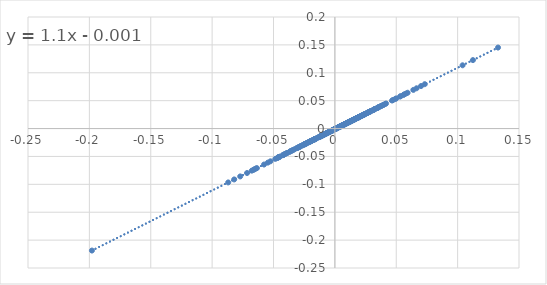
| Category | SPY |
|---|---|
| -0.007057278844575738 | -0.009 |
| 0.03949500980977561 | 0.042 |
| -0.029311915210731076 | -0.033 |
| 0.009613776960374448 | 0.01 |
| 0.07321012022250145 | 0.08 |
| -0.04629075040643459 | -0.052 |
| -0.03691800576843832 | -0.042 |
| 0.009399434370321041 | 0.009 |
| -0.0242675107539972 | -0.028 |
| 0.03738317757009344 | 0.04 |
| 0.011411053393510935 | 0.012 |
| 0.059263936496482116 | 0.064 |
| 0.022599391200073822 | 0.024 |
| -0.003401360544217729 | -0.005 |
| -0.06562446315066141 | -0.073 |
| 0.053670015386007845 | 0.058 |
| -0.016380308021009555 | -0.019 |
| -0.0009782995375311227 | -0.002 |
| 0.04731743666169894 | 0.051 |
| -0.046451727506883415 | -0.052 |
| -0.01625163826998689 | -0.019 |
| -0.07155025553662686 | -0.08 |
| -0.03898027598035405 | -0.044 |
| 0.02190885914595295 | 0.023 |
| -0.020140515222482423 | -0.023 |
| 0.003603885929175758 | 0.003 |
| 0.056010589889964386 | 0.061 |
| -0.0018992568125515258 | -0.003 |
| 0.0006610477607006966 | 0 |
| -0.021665319320937806 | -0.025 |
| -0.023138276869620094 | -0.026 |
| -0.0007102272727272996 | -0.002 |
| -0.003225045229292823 | -0.005 |
| -0.0011785040854808743 | -0.002 |
| -0.0163833075734158 | -0.019 |
| 0.01986128625472896 | 0.021 |
| 0.013175756607841503 | 0.013 |
| -0.006189984921831609 | -0.008 |
| -0.0021381057966423506 | -0.003 |
| 0.014052838673412029 | 0.014 |
| 0.027729636048526858 | 0.03 |
| -0.019342829394626098 | -0.022 |
| -0.01231015187849714 | -0.015 |
| 0.0011203585147247165 | 0 |
| -0.016372795969773396 | -0.019 |
| 0.010660302307080377 | 0.011 |
| 0.014937424303593126 | 0.015 |
| 0.02686344415885909 | 0.029 |
| -0.005032172908760926 | -0.007 |
| -0.00720720720720717 | -0.009 |
| 0.016991504247875995 | 0.018 |
| 0.01103157894736844 | 0.011 |
| 0.0011803389258915823 | 0 |
| 0.010478786846140774 | 0.011 |
| 0.0037626133059688537 | 0.003 |
| 0.012993762993762994 | 0.013 |
| 0.03440860215053767 | 0.037 |
| -0.012389380530973501 | -0.015 |
| 0.0007084661707403321 | 0 |
| -0.02047189451769604 | -0.024 |
| 0.03566615757793548 | 0.038 |
| 0.001169275049469288 | 0 |
| 0.005516867142986467 | 0.005 |
| 0.009956156375593616 | 0.01 |
| 0.016905071521456507 | 0.018 |
| -0.0018542555164101876 | -0.003 |
| 0.02072489826819341 | 0.022 |
| 0.014399539214745127 | 0.015 |
| 0.005404883698484724 | 0.005 |
| 0.03765648472709069 | 0.04 |
| -0.006269904458598822 | -0.008 |
| -0.007114624505928842 | -0.009 |
| -0.036374023995429376 | -0.041 |
| 0.01921583850931667 | 0.02 |
| -0.0012600562178927543 | -0.002 |
| 0.035219747140276994 | 0.038 |
| -0.012093576526566207 | -0.014 |
| 0.056335078534031365 | 0.061 |
| -0.05248536561166788 | -0.059 |
| -0.034578544061302674 | -0.039 |
| 0.023529411764705938 | 0.025 |
| 0.026776726394201696 | 0.028 |
| -0.02330154360436526 | -0.027 |
| 0.002365231102788951 | 0.002 |
| -0.04192238693230099 | -0.047 |
| 0.023581714506620256 | 0.025 |
| -0.0635351615530817 | -0.071 |
| -0.02462923728813565 | -0.028 |
| 0.02054054054054055 | 0.022 |
| -0.001618996222342209 | -0.003 |
| 0.014879050661798354 | 0.015 |
| 0.010422431285740595 | 0.01 |
| 0.005285118219749721 | 0.005 |
| 0.008603759468811254 | 0.008 |
| 0.010585010868537989 | 0.011 |
| 0.031688767550702025 | 0.034 |
| -0.0035946759933936125 | -0.005 |
| 0.028682790325804564 | 0.031 |
| 0.012958088681919428 | 0.013 |
| -0.006836919364568597 | -0.009 |
| -0.016707859614434127 | -0.019 |
| -0.03895486935866978 | -0.044 |
| -0.00810479690886815 | -0.01 |
| 0.02809805251429131 | 0.03 |
| -0.009215705097436959 | -0.011 |
| 0.02057411580288046 | 0.022 |
| -0.002735710796287261 | -0.004 |
| 0.000880109524740751 | 0 |
| 0.013077075490390404 | 0.013 |
| 0.0012895546076777647 | 0 |
| -0.0016835016835017003 | -0.003 |
| 0.023203972033640757 | 0.025 |
| 0.03448637316561836 | 0.037 |
| -0.04178384893531535 | -0.047 |
| -0.007476821852258 | -0.009 |
| 0.015180649731808521 | 0.016 |
| 0.04660523249655763 | 0.05 |
| -0.01881105799210146 | -0.022 |
| -0.021259281863493067 | -0.024 |
| 0.023422860712054964 | 0.025 |
| 0.02661109329913444 | 0.028 |
| -0.012766406414855538 | -0.015 |
| 0.0039190763690287525 | 0.003 |
| 0.021642679363705227 | 0.023 |
| -0.0039879284328519565 | -0.005 |
| 0.024174853736615494 | 0.026 |
| 0.007675194660734123 | 0.007 |
| 0.04171494785631528 | 0.045 |
| 0.07018849206349202 | 0.076 |
| -0.0206461015302405 | -0.024 |
| -0.022090261282660326 | -0.025 |
| -0.0021332069210712565 | -0.003 |
| -0.02653437932625763 | -0.03 |
| 0.005568445475638097 | 0.005 |
| 0.021811284969179747 | 0.023 |
| 0.039428289797930054 | 0.042 |
| 0.003461918892185969 | 0.003 |
| -0.04588887578152649 | -0.051 |
| 0.05790590290777488 | 0.063 |
| 0.014175420832805851 | 0.015 |
| -0.004786497039929405 | -0.006 |
| 0.014828071072478544 | 0.015 |
| 0.018354595157511207 | 0.019 |
| 0.03252688172042994 | 0.035 |
| 0.06392106392106389 | 0.069 |
| 0.015243902439024556 | 0.016 |
| 0.10402308062189446 | 0.113 |
| -0.06769276748356248 | -0.075 |
| -0.0450913242009132 | -0.051 |
| -0.06447737284741688 | -0.072 |
| -0.04852025911342572 | -0.054 |
| 0.050013336889837286 | 0.054 |
| -0.0033231423634188487 | -0.005 |
| -0.022987012987012934 | -0.026 |
| -0.045138888888888895 | -0.051 |
| -0.041711229946524125 | -0.047 |
| 0.06653992395437262 | 0.072 |
| -0.01164975573092813 | -0.014 |
| -0.0010011262670504104 | -0.002 |
| 0.012159594680177247 | 0.012 |
| -0.02398318704413398 | -0.027 |
| 0.13291316526610636 | 0.145 |
| -0.08202622782206216 | -0.091 |
| -0.07712387280493593 | -0.086 |
| -0.03059581320450882 | -0.035 |
| 0.11247600767754308 | 0.123 |
| -0.06619667821723016 | -0.074 |
| 0.053101799421165205 | 0.057 |
| -0.197920872022608 | -0.219 |
| -0.08690443277117323 | -0.097 |
| -0.026379542395693116 | -0.03 |
| -0.00994936483965524 | -0.012 |
| 0.013413755851638414 | 0.014 |
| -0.033918942424769574 | -0.038 |
| -0.006566442025228883 | -0.008 |
| -0.004044402375010747 | -0.005 |
| 0.006234306000519516 | 0.006 |
| 0.025392879339429988 | 0.027 |
| 0.005445456168541327 | 0.005 |
| -0.004001066951187009 | -0.005 |
| 0.017275687409551342 | 0.018 |
| -0.019510464703795697 | -0.022 |
| -0.00957400087834861 | -0.012 |
| -0.030816378649868092 | -0.035 |
| -0.02869191334546055 | -0.033 |
| -0.0010737589824068347 | -0.002 |
| -0.02887623325579537 | -0.033 |
| 0.019628690602764422 | 0.021 |
| -0.03511679292929295 | -0.04 |
| 0.027070838061274142 | 0.029 |
| -0.018456642800318276 | -0.021 |
| 0.013627933231191014 | 0.014 |
| 0.008129420372327452 | 0.008 |
| 0.038234301147873066 | 0.041 |
| -0.025657894736842025 | -0.029 |
| 0.040917651087142626 | 0.044 |
| -0.004346714395295365 | -0.006 |
| 0.024090075936108974 | 0.025 |
| -0.000697775839511666 | -0.002 |
| -0.03077183193845634 | -0.035 |
| -0.013263263263263174 | -0.016 |
| 0.003599832565927104 | 0.003 |
| 0.015558578473048786 | 0.016 |
| -0.0466850380936942 | -0.052 |
| 0.04914965986394559 | 0.053 |
| 0.0074530968902594905 | 0.007 |
| -0.05771714562479813 | -0.064 |
| -0.00824593707469379 | -0.01 |
| -0.040629800307219605 | -0.046 |
| -0.00565144340919512 | -0.007 |
| 0.011901081916537805 | 0.012 |
| -0.024794634109578658 | -0.028 |
| 0.0151480376405783 | 0.016 |
| 0.03140534995660068 | 0.034 |
| -0.011389343942585176 | -0.014 |
| 0.004466384579219504 | 0.004 |
| -0.04001805325710842 | -0.045 |
| -0.015769600947656736 | -0.018 |
| 0.02636778115501519 | 0.028 |
| -0.042560931247726405 | -0.048 |
| 0.003065022257899639 | 0.002 |
| 0.021392367322599914 | 0.023 |
| 0.0040413111809608744 | 0.003 |
| 0.025479662317728264 | 0.027 |
| 0.01932253774544327 | 0.02 |
| -0.010297305667389272 | -0.012 |
| -0.004930662557781316 | -0.006 |
| 0.024952621604548413 | 0.026 |
| 0.0 | -0.001 |
| 0.006357279084551789 | 0.006 |
| -0.009055831167808422 | -0.011 |
| -0.054641554381002135 | -0.061 |
| -0.0087078444395246 | -0.011 |
| 0.012250690968850274 | 0.012 |
| 0.016940139775144473 | 0.018 |
| -0.0008349146110057962 | -0.002 |
| -0.01642403882045531 | -0.019 |
| 0.01777980396626377 | 0.019 |
| -0.019737822136153563 | -0.023 |
| 0.01573611741564521 | 0.016 |
| -0.006090683510038365 | -0.008 |
| 0.011715481171548274 | 0.012 |
| -0.0003802281368822157 | -0.001 |
| 0.009286975209148883 | 0.009 |
| 0.006100386100386039 | 0.006 |
| 0.02274522192386665 | 0.024 |
| 0.007479312539783559 | 0.007 |
| 0.015760122848137097 | 0.016 |
| -0.009684648631342994 | -0.012 |
| 0.03504266423660015 | 0.038 |
| -0.012031429039122712 | -0.014 |
| 0.01520565018695482 | 0.016 |
| -0.0456744112282928 | -0.051 |
| -0.0029253636938646787 | -0.004 |
| 0.012406947890818835 | 0.013 |
| -0.005967536600891152 | -0.008 |
| 0.0188067444876784 | 0.02 |
| -0.004759983864461504 | -0.006 |
| -0.002976190476190399 | -0.004 |
| 0.019183472700442607 | 0.02 |
| -0.007566512082011168 | -0.009 |
| 0.006139489194499018 | 0.006 |
| -0.011170471102477009 | -0.013 |
| 0.012125184335572702 | 0.012 |
| 0.00859362088910929 | 0.008 |
| -0.00099058940069345 | -0.002 |
| -0.0004950495049505138 | -0.002 |
| 0.01584108624591401 | 0.016 |
| 0.012388629613916064 | 0.013 |
| -0.009913467193144643 | -0.012 |
| 0.007789348912031172 | 0.008 |
| 0.001526329178326063 | 0.001 |
| 0.012014073629108432 | 0.012 |
| 0.010755486165322186 | 0.011 |
| 0.016039481801357253 | 0.017 |
| -0.0036877688998156266 | -0.005 |
| 0.017329164805716817 | 0.018 |
| -0.008677942088019162 | -0.011 |
| 0.012371134020618643 | 0.013 |
| -0.0066785396260017815 | -0.008 |
| 0.028953637529778236 | 0.031 |
| -0.009259259259259224 | -0.011 |
| 0.001636661211129229 | 0.001 |
| 0.03257910055393858 | 0.035 |
| 0.0034859619370642978 | 0.003 |
| -0.024448529411764675 | -0.028 |
| -0.0052116668190546524 | -0.007 |
| 0.02281866641728231 | 0.024 |
| -0.0016805153580430642 | -0.003 |
| -0.0012122342409548253 | -0.002 |
| -0.028271112722000766 | -0.032 |
| 0.004825639624874817 | 0.004 |
| 0.010023910244620227 | 0.01 |
| -0.016550601428959016 | -0.019 |
| -0.024783912506614943 | -0.028 |
| 0.00800142247510661 | 0.008 |
| 0.0024955436720142704 | 0.002 |
| 0.018888485288775864 | 0.02 |
| -0.006406207705494845 | -0.008 |
| -0.0021607994958134052 | -0.003 |
| -0.002962298025134762 | -0.004 |
| -0.0031319910514540877 | -0.004 |
| 0.019802883737908394 | 0.021 |
| -0.001275975209624504 | -0.002 |
| -0.005077983315197699 | -0.007 |
| 0.0046460781634326785 | 0.004 |
| 0.01714232765011114 | 0.018 |
| 0.002973977695167355 | 0.002 |
| -0.017710425415373487 | -0.02 |
| 0.02040055891942256 | 0.021 |
| -0.020975832193342557 | -0.024 |
| 0.001827318410233009 | 0.001 |
| 0.031573986804901116 | 0.034 |
| -0.017774486206258117 | -0.021 |
| 0.003157503714710152 | 0.002 |
| 0.005603287261860371 | 0.005 |
| -0.004184878638519509 | -0.006 |
| -0.0021343726800297324 | -0.003 |
| 0.015932874516828625 | 0.017 |
| 0.011057096558955263 | 0.011 |
| 0.013525263259588362 | 0.014 |
| 0.0193008370260956 | 0.02 |
| 0.014181563966843122 | 0.015 |
| -0.004573019186797971 | -0.006 |
| -0.007890324489594607 | -0.01 |
| -0.027900287631831226 | -0.032 |
| 0.013211579560909263 | 0.014 |
| -0.016716018721940968 | -0.019 |
| -0.0045640391746696206 | -0.006 |
| 0.019089147286821692 | 0.02 |
| 0.012459531050721043 | 0.013 |
| -0.013930540775853706 | -0.016 |
| -0.00481370944449793 | -0.006 |
| 0.001446201311222577 | 0.001 |
| -0.00689391037916506 | -0.009 |
| 0.001534330648254666 | 0.001 |
| 0.005787037037036982 | 0.005 |
| 0.012500000000000011 | 0.013 |
| 0.014966795519873179 | 0.015 |
| 0.004580304689833652 | 0.004 |
| -0.01962124170245989 | -0.023 |
| 0.013755566551212278 | 0.014 |
| 0.0003960003960003172 | -0.001 |
| -0.0007913740231476733 | -0.002 |
| 0.009486718593968473 | 0.009 |
| 0.02939967105263157 | 0.031 |
| -0.011683429848623444 | -0.014 |
| 0.011509608467783419 | 0.012 |
| 0.0015438452037876255 | 0.001 |
| 0.012505210504376854 | 0.013 |
| -0.032661290322580736 | -0.037 |
| 0.004862236628849311 | 0.004 |
| 0.002437043054427243 | 0.002 |
| -0.011741093828399414 | -0.014 |
| -0.011506794960817345 | -0.014 |
| -0.01907171353507827 | -0.022 |
| 0.01071990558615253 | 0.011 |
| 0.00863009622061308 | 0.008 |
| -0.0031642440423216966 | -0.004 |
| 0.0044696066746125205 | 0.004 |
| 0.023899115224244975 | 0.025 |
| 0.005522037018099928 | 0.005 |
| -0.012321987678012309 | -0.015 |
| -0.0017140552530752339 | -0.003 |
| -0.020057306590257753 | -0.023 |
| 0.0007910610105804241 | 0 |
| 0.011097780443911213 | 0.011 |
| 0.005731523378582133 | 0.005 |
| 0.000603682463024472 | 0 |
| 0.0076034063260340635 | 0.007 |
| 0.007970570202329871 | 0.008 |
| -0.008611082970317034 | -0.01 |
| 0.01282577467679048 | 0.013 |
| 0.03603699372807485 | 0.039 |
| 0.029212253829321525 | 0.031 |
| -0.01146441704520861 | -0.014 |
| -0.011017221093165058 | -0.013 |
| -0.010059296908089823 | -0.012 |
| 0.019650183545670406 | 0.021 |
| -0.01499521429331061 | -0.017 |
| 0.005023514322359971 | 0.005 |
| 0.00840698426384998 | 0.008 |
| 0.005963352488344326 | 0.006 |
| 0.008749863283386165 | 0.009 |
| 0.030777903043968477 | 0.033 |
| 0.003166704365528174 | 0.002 |
| -0.03597906672481462 | -0.041 |
| 0.017189752689364502 | 0.018 |
| -0.015826238812486387 | -0.018 |
| -0.009085009733938885 | -0.011 |
| -0.010170217321485953 | -0.012 |
| -0.00849166755121534 | -0.01 |
| 0.0019142826757417059 | 0.001 |
| -0.002651675859142978 | -0.004 |
| 0.012022327179046851 | 0.012 |
| 0.0010745755426605878 | 0 |
| 0.027833001988071523 | 0.03 |
| -0.002094125427091345 | -0.003 |
| 0.00066174037719204 | 0 |
| -0.008962728167012714 | -0.011 |
| -0.02969561989606545 | -0.034 |
| 0.004581291284892466 | 0.004 |
| -0.004665959703075268 | -0.006 |
| -0.0023275497249259296 | -0.004 |
| 0.0324412889131622 | 0.035 |